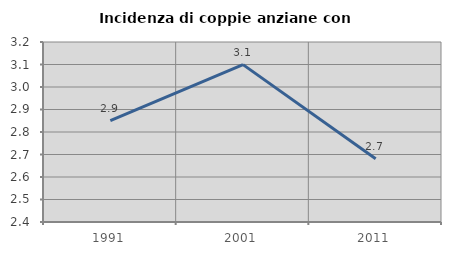
| Category | Incidenza di coppie anziane con figli |
|---|---|
| 1991.0 | 2.851 |
| 2001.0 | 3.099 |
| 2011.0 | 2.681 |